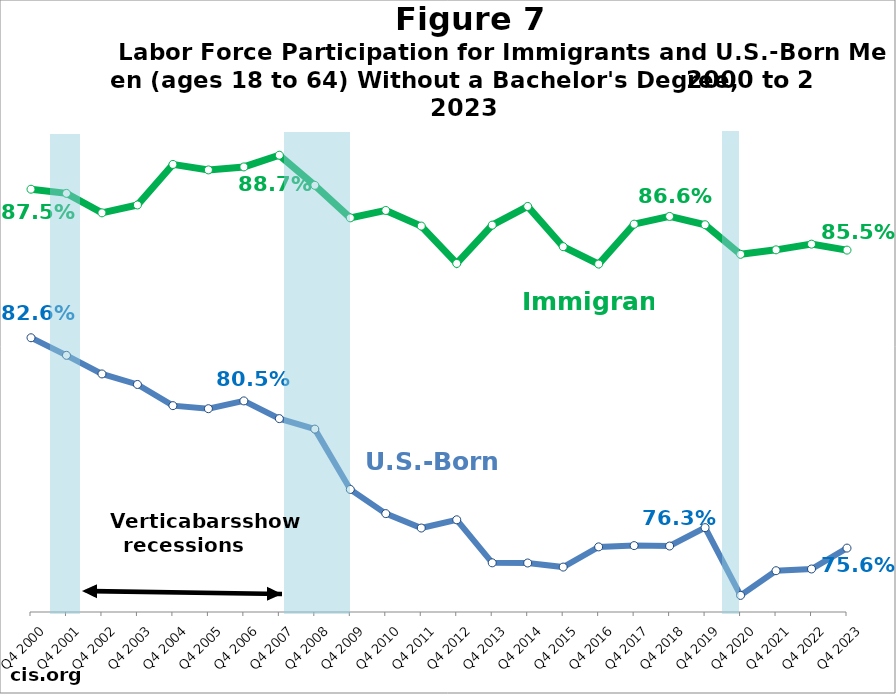
| Category | Native | Immigrant |
|---|---|---|
| Q4 2000 | 0.826 | 0.875 |
| Q4 2001 | 0.82 | 0.874 |
| Q4 2002 | 0.814 | 0.867 |
| Q4 2003 | 0.811 | 0.87 |
| Q4 2004 | 0.803 | 0.884 |
| Q4 2005 | 0.802 | 0.882 |
| Q4 2006 | 0.805 | 0.883 |
| Q4 2007 | 0.799 | 0.887 |
| Q4 2008 | 0.796 | 0.877 |
| Q4 2009 | 0.776 | 0.866 |
| Q4 2010 | 0.768 | 0.868 |
| Q4 2011 | 0.763 | 0.863 |
| Q4 2012 | 0.766 | 0.851 |
| Q4 2013 | 0.751 | 0.863 |
| Q4 2014 | 0.751 | 0.87 |
| Q4 2015 | 0.75 | 0.856 |
| Q4 2016 | 0.757 | 0.85 |
| Q4 2017 | 0.757 | 0.864 |
| Q4 2018 | 0.757 | 0.866 |
| Q4 2019 | 0.763 | 0.864 |
| Q4 2020 | 0.741 | 0.854 |
| Q4 2021 | 0.749 | 0.855 |
| Q4 2022 | 0.749 | 0.857 |
| Q4 2023 | 0.756 | 0.855 |